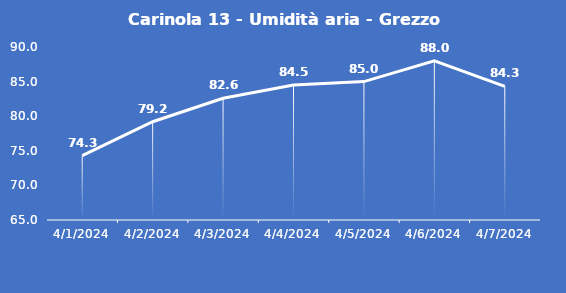
| Category | Carinola 13 - Umidità aria - Grezzo (%) |
|---|---|
| 4/1/24 | 74.3 |
| 4/2/24 | 79.2 |
| 4/3/24 | 82.6 |
| 4/4/24 | 84.5 |
| 4/5/24 | 85 |
| 4/6/24 | 88 |
| 4/7/24 | 84.3 |